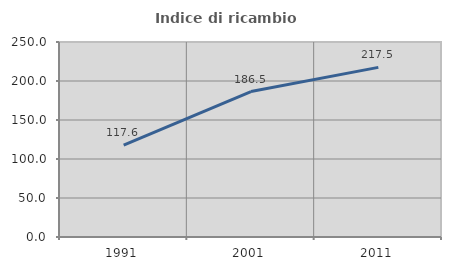
| Category | Indice di ricambio occupazionale  |
|---|---|
| 1991.0 | 117.647 |
| 2001.0 | 186.477 |
| 2011.0 | 217.471 |